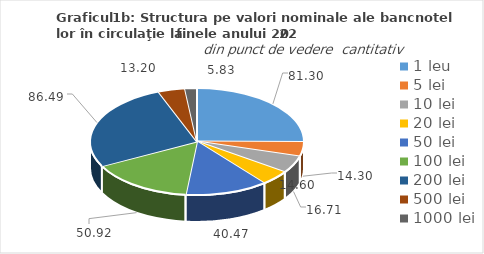
| Category | Series 0 |
|---|---|
| 1 leu | 81.3 |
| 5 lei | 14.3 |
| 10 lei | 16.71 |
| 20 lei | 14.595 |
| 50 lei | 40.472 |
| 100 lei | 50.924 |
| 200 lei | 86.488 |
| 500 lei | 13.195 |
| 1000 lei | 5.832 |